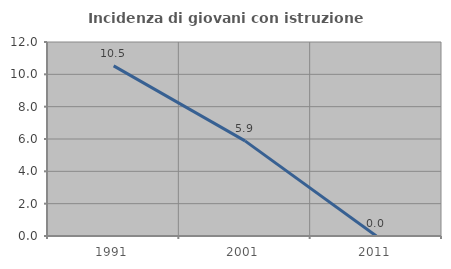
| Category | Incidenza di giovani con istruzione universitaria |
|---|---|
| 1991.0 | 10.526 |
| 2001.0 | 5.882 |
| 2011.0 | 0 |